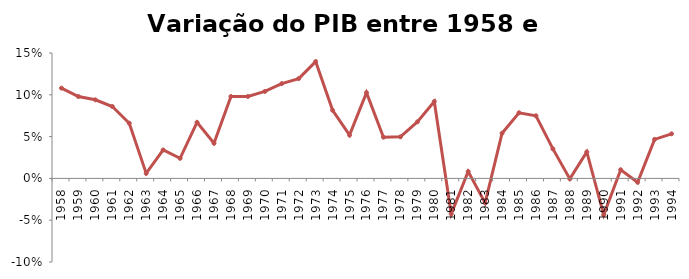
| Category | PIB |
|---|---|
| 1958.0 | 0.108 |
| 1959.0 | 0.098 |
| 1960.0 | 0.094 |
| 1961.0 | 0.086 |
| 1962.0 | 0.066 |
| 1963.0 | 0.006 |
| 1964.0 | 0.034 |
| 1965.0 | 0.024 |
| 1966.0 | 0.067 |
| 1967.0 | 0.042 |
| 1968.0 | 0.098 |
| 1969.0 | 0.098 |
| 1970.0 | 0.104 |
| 1971.0 | 0.113 |
| 1972.0 | 0.119 |
| 1973.0 | 0.14 |
| 1974.0 | 0.082 |
| 1975.0 | 0.052 |
| 1976.0 | 0.103 |
| 1977.0 | 0.049 |
| 1978.0 | 0.05 |
| 1979.0 | 0.068 |
| 1980.0 | 0.092 |
| 1981.0 | -0.042 |
| 1982.0 | 0.008 |
| 1983.0 | -0.029 |
| 1984.0 | 0.054 |
| 1985.0 | 0.078 |
| 1986.0 | 0.075 |
| 1987.0 | 0.035 |
| 1988.0 | -0.001 |
| 1989.0 | 0.032 |
| 1990.0 | -0.044 |
| 1991.0 | 0.01 |
| 1992.0 | -0.005 |
| 1993.0 | 0.047 |
| 1994.0 | 0.053 |